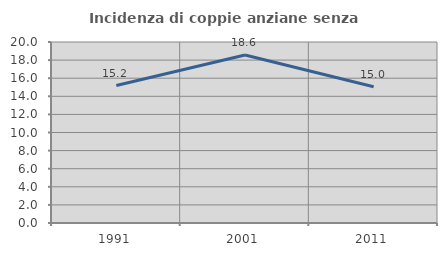
| Category | Incidenza di coppie anziane senza figli  |
|---|---|
| 1991.0 | 15.186 |
| 2001.0 | 18.566 |
| 2011.0 | 15.05 |